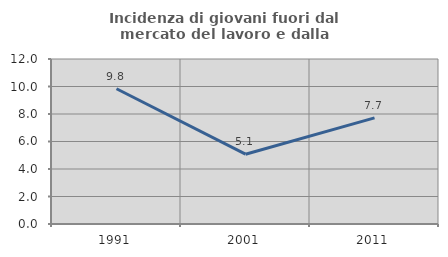
| Category | Incidenza di giovani fuori dal mercato del lavoro e dalla formazione  |
|---|---|
| 1991.0 | 9.836 |
| 2001.0 | 5.076 |
| 2011.0 | 7.721 |